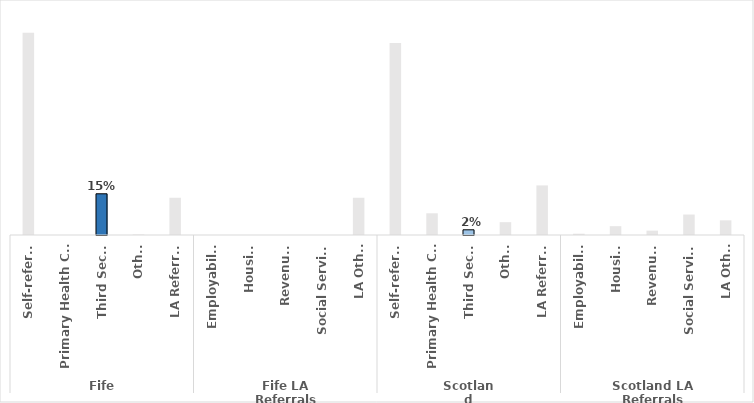
| Category | 2019/20 |
|---|---|
| 0 | 0.719 |
| 1 | 0 |
| 2 | 0.147 |
| 3 | 0.002 |
| 4 | 0.132 |
| 5 | 0 |
| 6 | 0 |
| 7 | 0 |
| 8 | 0 |
| 9 | 0.132 |
| 10 | 0.682 |
| 11 | 0.077 |
| 12 | 0.018 |
| 13 | 0.046 |
| 14 | 0.176 |
| 15 | 0.005 |
| 16 | 0.031 |
| 17 | 0.015 |
| 18 | 0.073 |
| 19 | 0.052 |